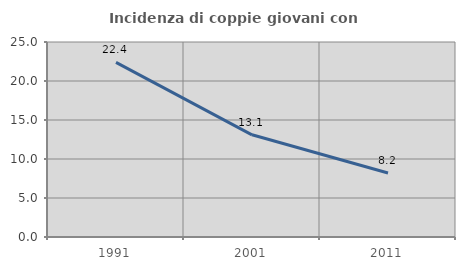
| Category | Incidenza di coppie giovani con figli |
|---|---|
| 1991.0 | 22.381 |
| 2001.0 | 13.1 |
| 2011.0 | 8.203 |